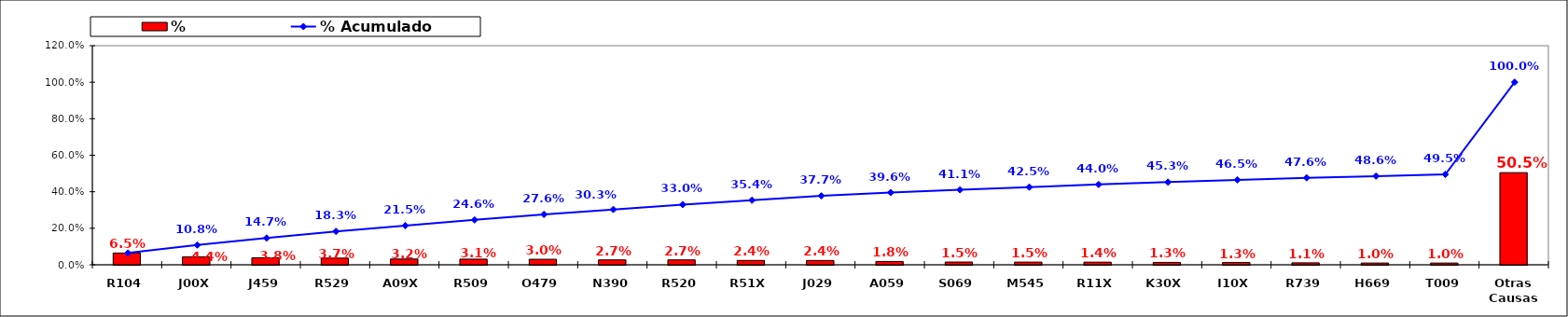
| Category | % |
|---|---|
| R104 | 0.065 |
| J00X | 0.044 |
| J459 | 0.038 |
| R529 | 0.037 |
| A09X | 0.032 |
| R509 | 0.031 |
| O479 | 0.03 |
| N390 | 0.027 |
| R520 | 0.027 |
| R51X | 0.024 |
| J029 | 0.024 |
| A059 | 0.018 |
| S069 | 0.015 |
| M545 | 0.015 |
| R11X | 0.014 |
| K30X | 0.013 |
| I10X | 0.013 |
| R739 | 0.011 |
| H669 | 0.01 |
| T009 | 0.01 |
| Otras Causas | 0.505 |